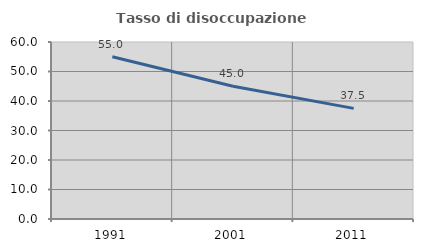
| Category | Tasso di disoccupazione giovanile  |
|---|---|
| 1991.0 | 55 |
| 2001.0 | 45 |
| 2011.0 | 37.5 |